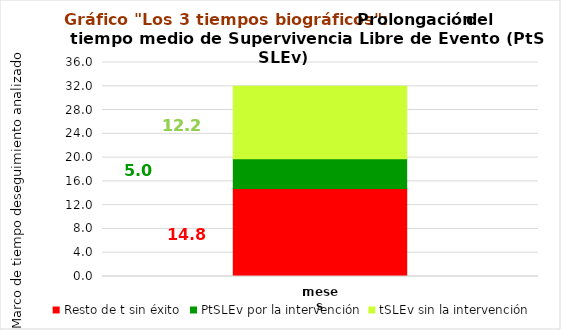
| Category | Resto de t sin éxito | PtSLEv por la intervención | tSLEv sin la intervención |
|---|---|---|---|
| meses | 14.789 | 5.035 | 12.176 |